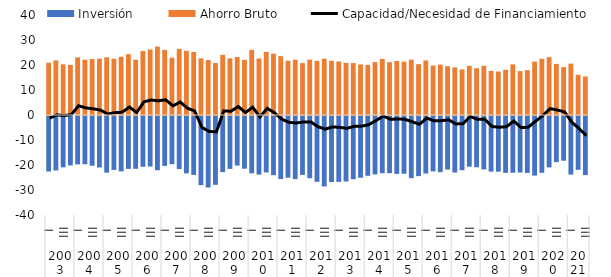
| Category | Inversión | Ahorro Bruto |
|---|---|---|
| 0 | -22.198 | 20.908 |
| 1 | -21.793 | 21.846 |
| 2 | -20.537 | 20.268 |
| 3 | -19.786 | 20.014 |
| 4 | -19.361 | 23.061 |
| 5 | -19.279 | 22.114 |
| 6 | -19.883 | 22.385 |
| 7 | -20.582 | 22.548 |
| 8 | -22.664 | 23.064 |
| 9 | -21.559 | 22.498 |
| 10 | -22.168 | 23.281 |
| 11 | -21.152 | 24.324 |
| 12 | -21.116 | 22.107 |
| 13 | -20.322 | 25.582 |
| 14 | -20.204 | 26.194 |
| 15 | -21.694 | 27.35 |
| 16 | -19.958 | 26.047 |
| 17 | -19.276 | 22.923 |
| 18 | -21.232 | 26.44 |
| 19 | -22.946 | 25.657 |
| 20 | -23.573 | 25.195 |
| 21 | -27.655 | 22.676 |
| 22 | -28.611 | 22.004 |
| 23 | -27.526 | 20.793 |
| 24 | -22.434 | 24.068 |
| 25 | -21.158 | 22.662 |
| 26 | -19.809 | 23.211 |
| 27 | -21.086 | 22.057 |
| 28 | -22.929 | 26.035 |
| 29 | -23.44 | 22.614 |
| 30 | -22.573 | 25.244 |
| 31 | -23.676 | 24.541 |
| 32 | -25.232 | 23.555 |
| 33 | -24.663 | 21.721 |
| 34 | -25.262 | 22.076 |
| 35 | -23.558 | 20.759 |
| 36 | -24.892 | 22.133 |
| 37 | -26.319 | 21.646 |
| 38 | -28.173 | 22.513 |
| 39 | -26.419 | 21.667 |
| 40 | -26.345 | 21.405 |
| 41 | -26.195 | 20.855 |
| 42 | -25.294 | 20.772 |
| 43 | -24.707 | 20.224 |
| 44 | -23.917 | 20.054 |
| 45 | -23.366 | 21.143 |
| 46 | -22.869 | 22.46 |
| 47 | -22.865 | 21.123 |
| 48 | -23.152 | 21.597 |
| 49 | -23.094 | 21.353 |
| 50 | -24.854 | 22.145 |
| 51 | -24.053 | 20.338 |
| 52 | -23.002 | 21.803 |
| 53 | -22.13 | 19.781 |
| 54 | -22.46 | 20.171 |
| 55 | -21.428 | 19.517 |
| 56 | -22.614 | 19.041 |
| 57 | -21.695 | 18.236 |
| 58 | -20.278 | 19.671 |
| 59 | -20.503 | 18.735 |
| 60 | -21.36 | 19.674 |
| 61 | -22.237 | 17.623 |
| 62 | -22.276 | 17.391 |
| 63 | -22.744 | 18.088 |
| 64 | -22.689 | 20.249 |
| 65 | -22.612 | 17.553 |
| 66 | -22.782 | 17.93 |
| 67 | -23.839 | 21.343 |
| 68 | -22.704 | 22.513 |
| 69 | -20.576 | 23.129 |
| 70 | -18.447 | 20.436 |
| 71 | -17.894 | 19.13 |
| 72 | -23.44 | 20.544 |
| 73 | -21.537 | 16.091 |
| 74 | -23.648 | 15.402 |